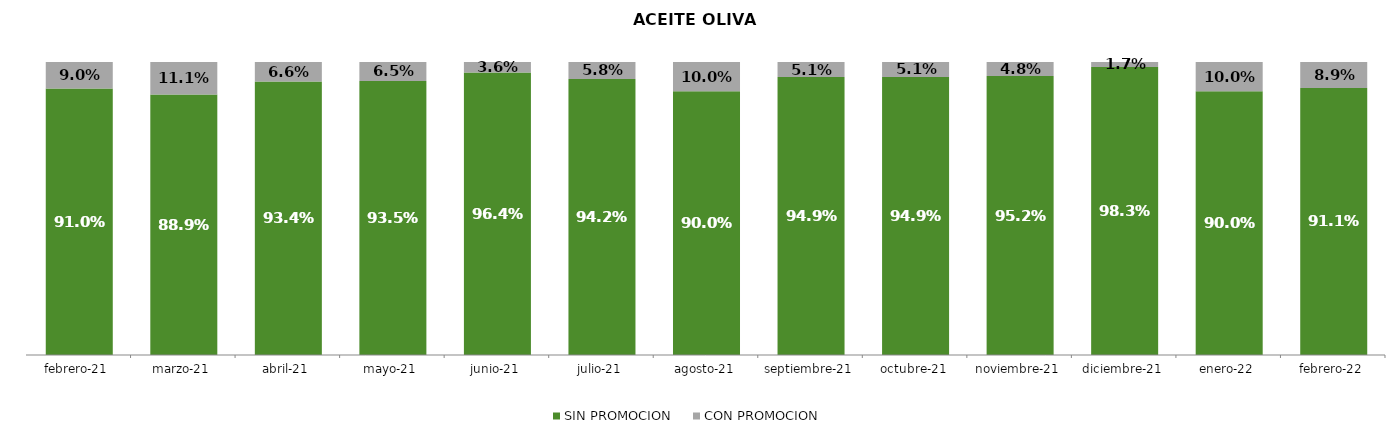
| Category | SIN PROMOCION   | CON PROMOCION   |
|---|---|---|
| 2021-02-01 | 0.91 | 0.09 |
| 2021-03-01 | 0.889 | 0.111 |
| 2021-04-01 | 0.934 | 0.066 |
| 2021-05-01 | 0.935 | 0.065 |
| 2021-06-01 | 0.964 | 0.036 |
| 2021-07-01 | 0.942 | 0.058 |
| 2021-08-01 | 0.9 | 0.1 |
| 2021-09-01 | 0.949 | 0.051 |
| 2021-10-01 | 0.949 | 0.051 |
| 2021-11-01 | 0.952 | 0.048 |
| 2021-12-01 | 0.983 | 0.017 |
| 2022-01-01 | 0.9 | 0.1 |
| 2022-02-01 | 0.911 | 0.089 |